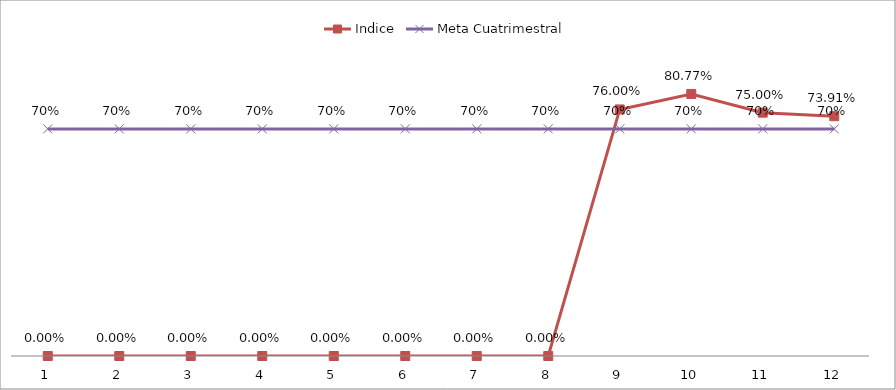
| Category | Indice | Meta Cuatrimestral |
|---|---|---|
| 0 | 0 | 0.7 |
| 1 | 0 | 0.7 |
| 2 | 0 | 0.7 |
| 3 | 0 | 0.7 |
| 4 | 0 | 0.7 |
| 5 | 0 | 0.7 |
| 6 | 0 | 0.7 |
| 7 | 0 | 0.7 |
| 8 | 0.76 | 0.7 |
| 9 | 0.808 | 0.7 |
| 10 | 0.75 | 0.7 |
| 11 | 0.739 | 0.7 |